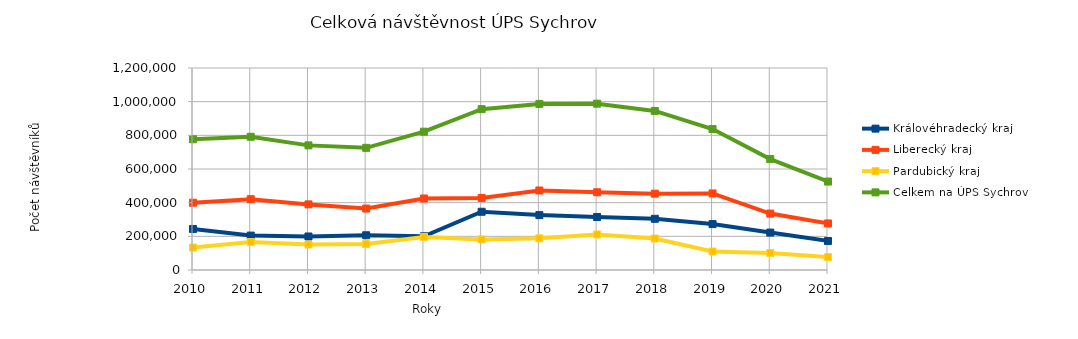
| Category | Královéhradecký kraj | Liberecký kraj | Pardubický kraj | Celkem na ÚPS Sychrov |
|---|---|---|---|---|
| 2010.0 | 243910 | 399672 | 133004 | 776586 |
| 2011.0 | 204481 | 420780 | 166238 | 791499 |
| 2012.0 | 199025 | 389781 | 151509 | 740315 |
| 2013.0 | 206419 | 365108 | 154165 | 725692 |
| 2014.0 | 200438 | 424718 | 196473 | 821629 |
| 2015.0 | 345970 | 428023 | 181567 | 955560 |
| 2016.0 | 326137 | 472318 | 188108 | 986563 |
| 2017.0 | 314983 | 461803 | 211268 | 988054 |
| 2018.0 | 304267 | 453568 | 187017 | 944852 |
| 2019.0 | 272720 | 454785 | 109949 | 837454 |
| 2020.0 | 222238 | 335261 | 101211 | 658710 |
| 2021.0 | 172524 | 276569 | 76298 | 525391 |